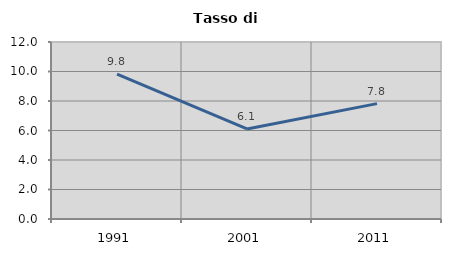
| Category | Tasso di disoccupazione   |
|---|---|
| 1991.0 | 9.815 |
| 2001.0 | 6.105 |
| 2011.0 | 7.823 |